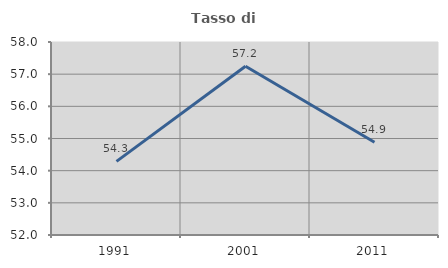
| Category | Tasso di occupazione   |
|---|---|
| 1991.0 | 54.29 |
| 2001.0 | 57.249 |
| 2011.0 | 54.883 |